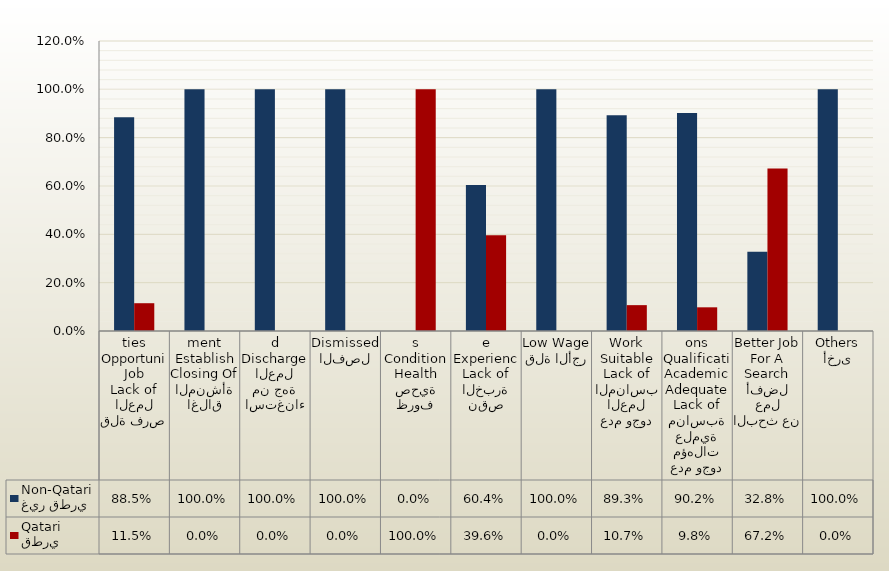
| Category | غير قطري
Non-Qatari | قطري
Qatari |
|---|---|---|
| قلة فرص العمل
Lack of Job Opportunities | 0.885 | 0.115 |
| اغلاق المنشأة
Closing Of Establishment | 1 | 0 |
| استغناء من جهة العمل
Discharged | 1 | 0 |
| الفصل
Dismissed | 1 | 0 |
| ظروف صحية
Health Conditions | 0 | 1 |
| نقص الخبرة
Lack of Experience | 0.604 | 0.396 |
| قلة الأجر
Low Wage | 1 | 0 |
| عدم وجود العمل المناسب
Lack of Suitable Work | 0.893 | 0.107 |
| عدم وجود مؤهلات علمية مناسبة
Lack of Adequate Academic Qualifications | 0.902 | 0.098 |
| البحث عن عمل أفضل
Search For A Better Job | 0.328 | 0.672 |
| أخرى
Others | 1 | 0 |